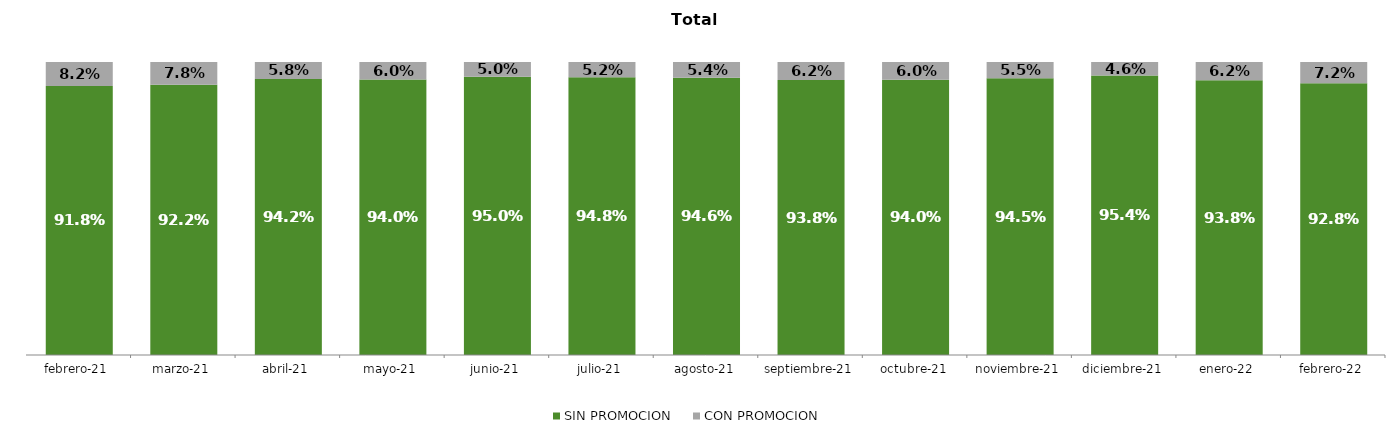
| Category | SIN PROMOCION   | CON PROMOCION   |
|---|---|---|
| 2021-02-01 | 0.918 | 0.082 |
| 2021-03-01 | 0.922 | 0.078 |
| 2021-04-01 | 0.942 | 0.058 |
| 2021-05-01 | 0.94 | 0.06 |
| 2021-06-01 | 0.95 | 0.05 |
| 2021-07-01 | 0.948 | 0.052 |
| 2021-08-01 | 0.946 | 0.054 |
| 2021-09-01 | 0.938 | 0.062 |
| 2021-10-01 | 0.94 | 0.06 |
| 2021-11-01 | 0.945 | 0.055 |
| 2021-12-01 | 0.954 | 0.046 |
| 2022-01-01 | 0.938 | 0.062 |
| 2022-02-01 | 0.928 | 0.072 |